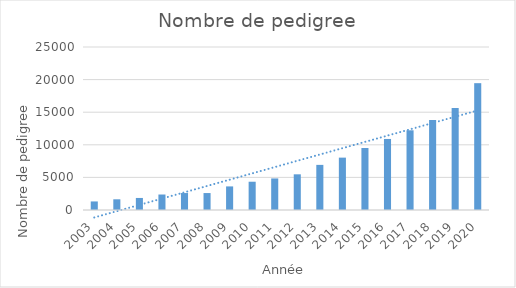
| Category | Series 0 |
|---|---|
| 2003.0 | 1313 |
| 2004.0 | 1642 |
| 2005.0 | 1847 |
| 2006.0 | 2375 |
| 2007.0 | 2601 |
| 2008.0 | 2600 |
| 2009.0 | 3619 |
| 2010.0 | 4336 |
| 2011.0 | 4840 |
| 2012.0 | 5473 |
| 2013.0 | 6920 |
| 2014.0 | 8032 |
| 2015.0 | 9513 |
| 2016.0 | 10897 |
| 2017.0 | 12224 |
| 2018.0 | 13808 |
| 2019.0 | 15648 |
| 2020.0 | 19452 |